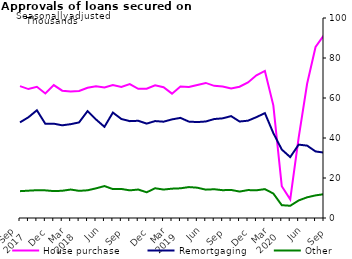
| Category | House purchase | Remortgaging | Other |
|---|---|---|---|
| Sep 
2017 | 65.93 | 47.825 | 13.422 |
|  | 64.464 | 50.371 | 13.662 |
|  | 65.598 | 53.867 | 13.895 |
| Dec | 62.26 | 47.094 | 13.82 |
|  | 66.475 | 47.155 | 13.453 |
|  | 63.658 | 46.346 | 13.615 |
| Mar 
2018 | 63.23 | 46.912 | 14.231 |
|  | 63.496 | 47.797 | 13.575 |
|  | 65.134 | 53.459 | 13.855 |
| Jun | 65.809 | 49.268 | 14.82 |
|  | 65.24 | 45.586 | 15.971 |
|  | 66.471 | 52.718 | 14.447 |
| Sep | 65.537 | 49.515 | 14.522 |
|  | 66.921 | 48.43 | 13.816 |
|  | 64.621 | 48.61 | 14.23 |
| Dec | 64.618 | 47.194 | 12.843 |
|  | 66.375 | 48.459 | 14.87 |
|  | 65.354 | 48.154 | 14.225 |
| Mar 
2019 | 62.176 | 49.302 | 14.668 |
|  | 65.797 | 50.059 | 14.843 |
|  | 65.556 | 48.191 | 15.461 |
| Jun | 66.529 | 47.964 | 15.151 |
|  | 67.539 | 48.253 | 14.173 |
|  | 66.087 | 49.481 | 14.38 |
| Sep | 65.78 | 49.829 | 13.905 |
|  | 64.81 | 50.941 | 14.043 |
|  | 65.637 | 48.245 | 13.215 |
| Dec | 67.775 | 48.659 | 13.959 |
|  | 71.321 | 50.438 | 13.852 |
|  | 73.556 | 52.432 | 14.436 |
| Mar 
2020 | 56.307 | 42.443 | 12.234 |
|  | 15.916 | 34.233 | 6.404 |
|  | 9.338 | 30.441 | 6.114 |
| Jun | 40.221 | 36.682 | 8.776 |
|  | 67.098 | 36.188 | 10.344 |
|  | 85.53 | 33.277 | 11.304 |
| Sep | 91.454 | 32.691 | 11.904 |